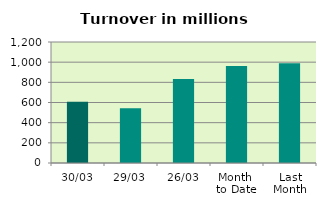
| Category | Series 0 |
|---|---|
| 30/03 | 607.878 |
| 29/03 | 542.662 |
| 26/03 | 832.277 |
| Month 
to Date | 961.619 |
| Last
Month | 989.924 |